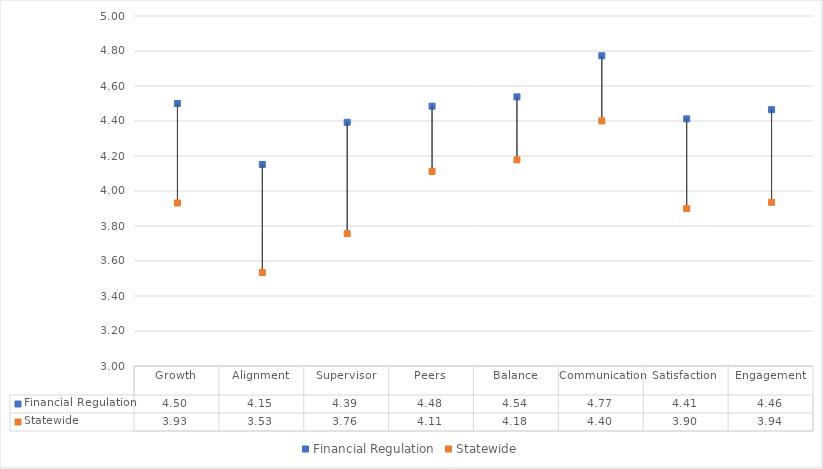
| Category | Financial Regulation | Statewide |
|---|---|---|
| Growth | 4.5 | 3.931 |
| Alignment | 4.152 | 3.534 |
| Supervisor | 4.393 | 3.756 |
| Peers | 4.485 | 4.112 |
| Balance | 4.538 | 4.178 |
| Communication | 4.773 | 4.4 |
| Satisfaction | 4.412 | 3.899 |
| Engagement | 4.465 | 3.936 |